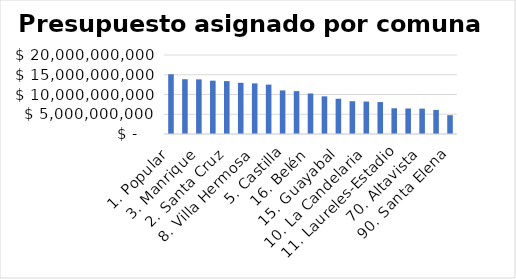
| Category | Presupuesto Participativo 2020 |
|---|---|
| 1. Popular | 15132784639 |
| 6. Doce de Octubre | 13869341570 |
| 3. Manrique | 13829617236 |
| 7. Robledo | 13504006068 |
| 2. Santa Cruz | 13390918142 |
| 13. San Javier | 12963971557 |
| 8. Villa Hermosa | 12818041548 |
| 4. Aranjuez | 12506686113 |
| 5. Castilla | 11038569814 |
| 9. Buenos Aires | 10851650236 |
| 16. Belén | 10259554716 |
| 80. San Antonio de Prado | 9534628954 |
| 15. Guayabal | 8930753649 |
| 12. La América | 8299851790 |
| 10. La Candelaria | 8215250660 |
| 60. San Cristobal | 8082232236 |
| 11. Laureles-Estadio | 6516968803 |
| 50. San Sebastián de Palmitas | 6464357220 |
| 70. Altavista | 6423017238 |
| 14. El Poblado | 6092698069 |
| 90. Santa Elena | 4760495004 |